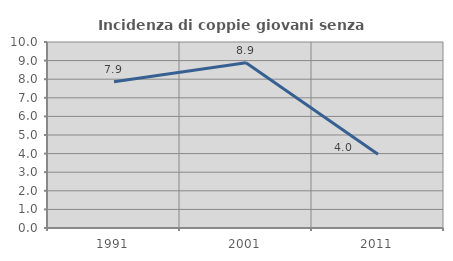
| Category | Incidenza di coppie giovani senza figli |
|---|---|
| 1991.0 | 7.862 |
| 2001.0 | 8.881 |
| 2011.0 | 3.964 |